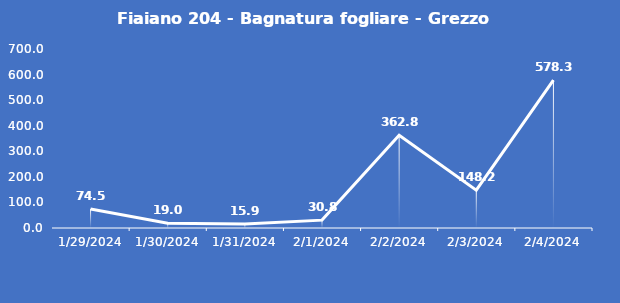
| Category | Fiaiano 204 - Bagnatura fogliare - Grezzo (min) |
|---|---|
| 1/29/24 | 74.5 |
| 1/30/24 | 19 |
| 1/31/24 | 15.9 |
| 2/1/24 | 30.8 |
| 2/2/24 | 362.8 |
| 2/3/24 | 148.2 |
| 2/4/24 | 578.3 |